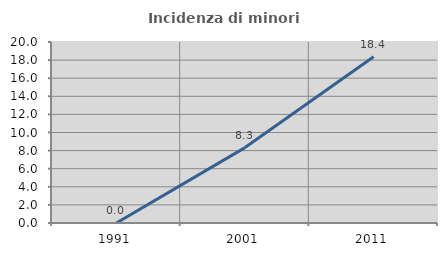
| Category | Incidenza di minori stranieri |
|---|---|
| 1991.0 | 0 |
| 2001.0 | 8.333 |
| 2011.0 | 18.367 |